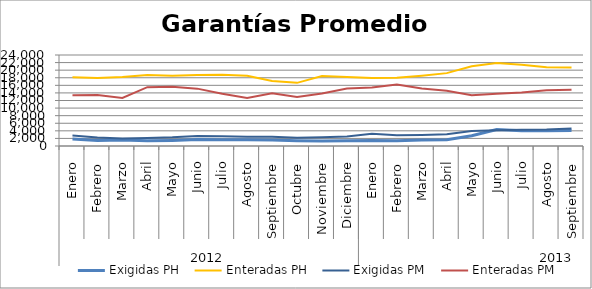
| Category | Exigidas PH | Enteradas PH | Exigidas PM | Enteradas PM |
|---|---|---|---|---|
| 0 | 1828.564 | 18155.583 | 2744.93 | 13413.991 |
| 1 | 1451.155 | 17917.734 | 2215.902 | 13440.832 |
| 2 | 1587.31 | 18166.129 | 1968.766 | 12673.714 |
| 3 | 1353.003 | 18741.256 | 2118.782 | 15515.723 |
| 4 | 1464.668 | 18540.927 | 2278.002 | 15625.393 |
| 5 | 1719.43 | 18734.539 | 2626.915 | 15127.903 |
| 6 | 1674.023 | 18761.463 | 2556.575 | 13766.49 |
| 7 | 1647.243 | 18544.546 | 2463.76 | 12637.427 |
| 8 | 1556.152 | 17124.972 | 2459.803 | 13929.715 |
| 9 | 1402.926 | 16653.067 | 2169.047 | 12937.81 |
| 10 | 1329.011 | 18467.462 | 2322.009 | 13825.53 |
| 11 | 1379.519 | 18204.98 | 2522.413 | 15188.776 |
| 12 | 1462.675 | 17957.148 | 3246.817 | 15415.235 |
| 13 | 1398.609 | 17993.637 | 2845.352 | 16230.589 |
| 14 | 1589.589 | 18548.479 | 2894.834 | 15192.36 |
| 15 | 1623.519 | 19220.98 | 3086.854 | 14555.102 |
| 16 | 2700.009 | 21053.59 | 3968.296 | 13386.678 |
| 17 | 4335.591 | 21872.028 | 4126.324 | 13759.513 |
| 18 | 4053.78 | 21401.693 | 4283.155 | 14110.316 |
| 19 | 4016.859 | 20783.858 | 4341.698 | 14691.614 |
| 20 | 4109.679 | 20689.944 | 4647.813 | 14857.936 |